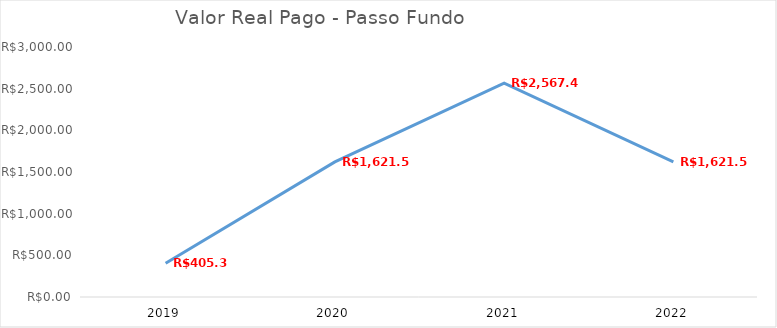
| Category | Series 0 |
|---|---|
| 2019.0 | 405.39 |
| 2020.0 | 1621.56 |
| 2021.0 | 2567.47 |
| 2022.0 | 1621.56 |